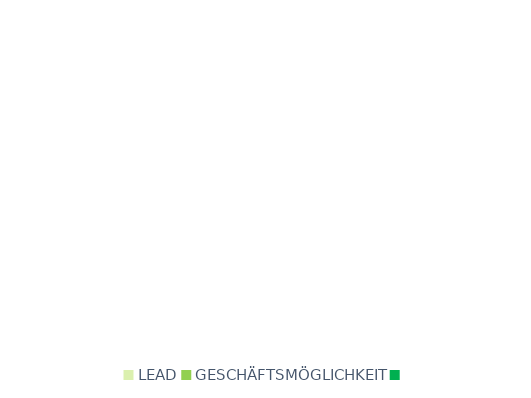
| Category | Series 0 |
|---|---|
| LEAD | 0 |
| GESCHÄFTSMÖGLICHKEIT | 0 |